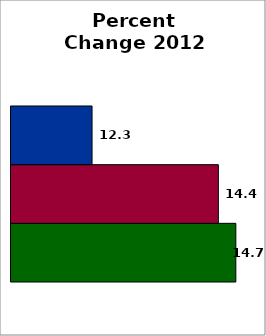
| Category | School | SREB states (average) | 50 states and D.C. (average) |
|---|---|---|---|
| 0 | 14.656 | 14.371 | 12.318 |